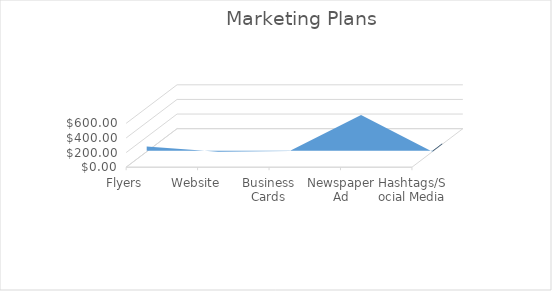
| Category | Series 0 |
|---|---|
| Flyers | 68.81 |
| Website | 0 |
| Business Cards | 10 |
| Newspaper Ad | 500 |
| Hashtags/Social Media | 0 |